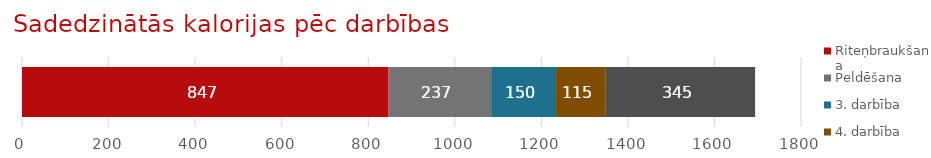
| Category | Riteņbraukšana | Peldēšana | 3. darbība | 4. darbība | 5. darbība |
|---|---|---|---|---|---|
| Darbību skaitītājs | 847 | 237 | 150 | 115 | 345 |